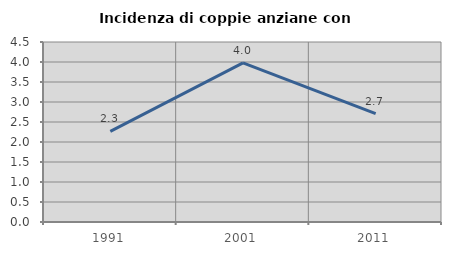
| Category | Incidenza di coppie anziane con figli |
|---|---|
| 1991.0 | 2.266 |
| 2001.0 | 3.98 |
| 2011.0 | 2.709 |